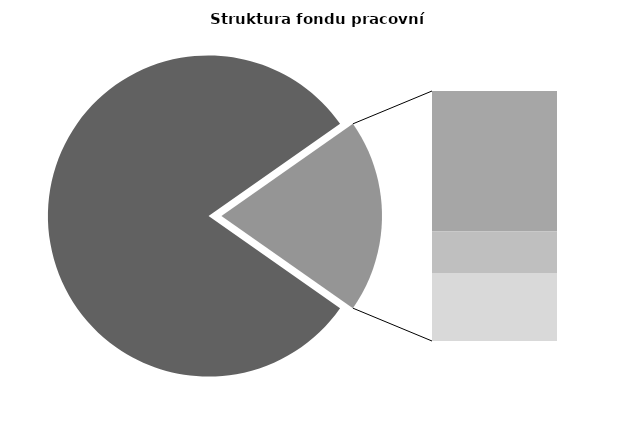
| Category | Series 0 |
|---|---|
| Průměrná měsíční odpracovaná doba bez přesčasu | 138.465 |
| Dovolená | 18.751 |
| Nemoc | 5.615 |
| Jiné | 9.085 |